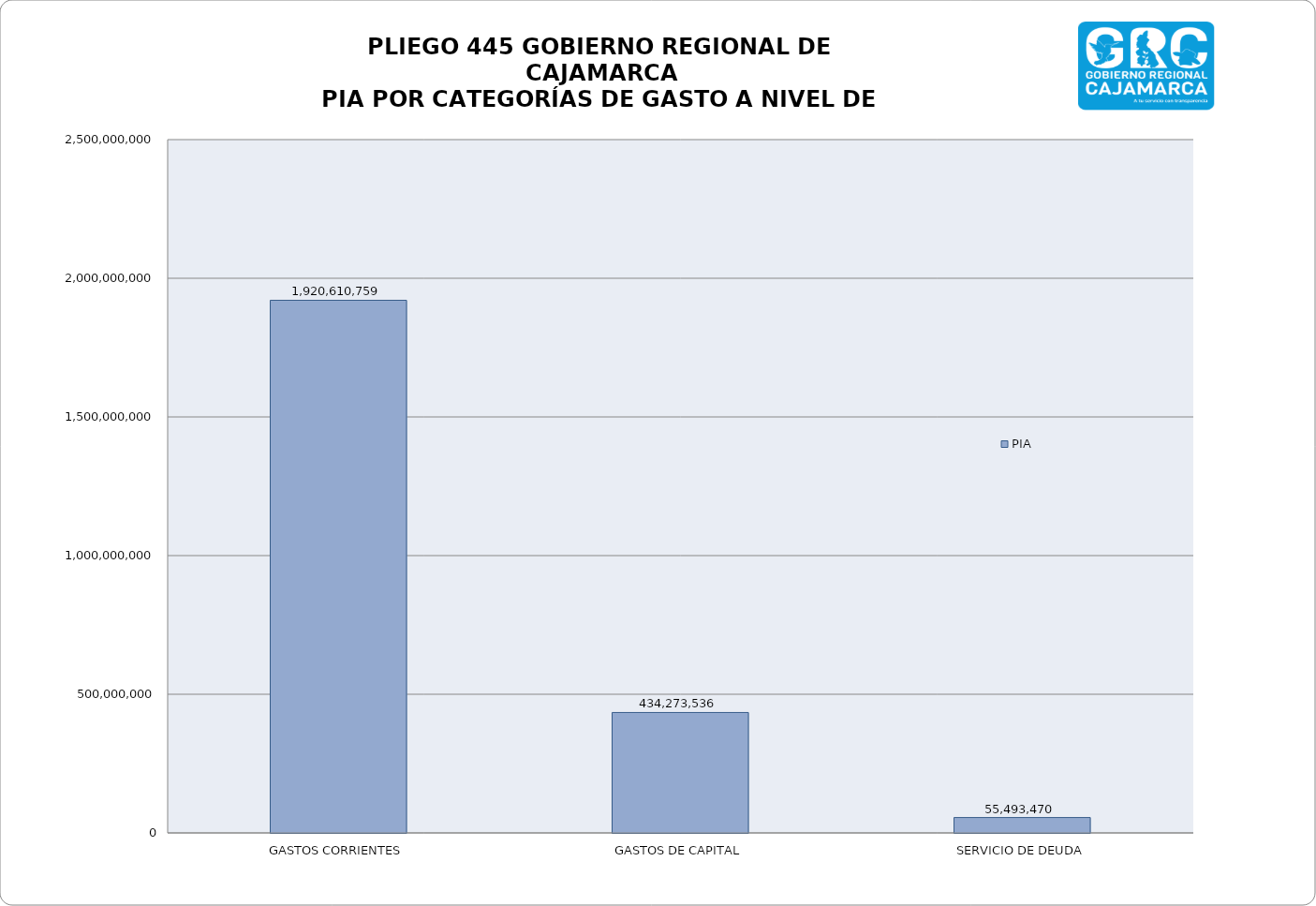
| Category | PIA |
|---|---|
| GASTOS CORRIENTES | 1920610759 |
| GASTOS DE CAPITAL | 434273536 |
| SERVICIO DE DEUDA | 55493470 |